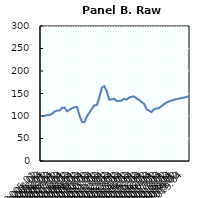
| Category | Raw materials |
|---|---|
| 2005:01 | 100 |
| 2005:02 | 100.169 |
| 2005:03 | 101.896 |
| 2005:04 | 102.191 |
| 2006:01 | 105.183 |
| 2006:02 | 110.029 |
| 2006:03 | 111.968 |
| 2006:04 | 112.347 |
| 2007:01 | 118.373 |
| 2007:02 | 118.668 |
| 2007:03 | 110.535 |
| 2007:04 | 113.906 |
| 2008:01 | 117.488 |
| 2008:02 | 119.385 |
| 2008:03 | 119.89 |
| 2008:04 | 101.475 |
| 2009:01 | 87.021 |
| 2009:02 | 86.304 |
| 2009:03 | 99.157 |
| 2009:04 | 107.206 |
| 2010:01 | 116.182 |
| 2010:02 | 123.683 |
| 2010:03 | 124.231 |
| 2010:04 | 141.593 |
| 2011:01 | 163.211 |
| 2011:02 | 166.33 |
| 2011:03 | 154.488 |
| 2011:04 | 136.241 |
| 2012:01 | 137 |
| 2012:02 | 138.053 |
| 2012:03 | 133.249 |
| 2012:04 | 133.418 |
| 2013:01 | 134.555 |
| 2013:02 | 138.432 |
| 2013:03 | 136.452 |
| 2013:04 | 140.834 |
| 2014:01 | 142.773 |
| 2014:02 | 143.447 |
| 2014:03 | 139.191 |
| 2014:04 | 135.651 |
| 2015:01 | 130.973 |
| 2015:02 | 127.307 |
| 2015:03 | 115.129 |
| 2015:04 | 112.094 |
| 2016:01 | 108.681 |
| 2016:02 | 114.876 |
| 2016:03 | 116.772 |
| 2016:04 | 117.488 |
| 2017:01 | 121.702 |
| 2017:02 | 126.072 |
| 2017:03 | 129.66 |
| 2017:04 | 132.402 |
| 2018:01 | 134.365 |
| 2018:02 | 135.901 |
| 2018:03 | 137.293 |
| 2018:04 | 138.54 |
| 2019:01 | 139.75 |
| 2019:02 | 140.946 |
| 2019:03 | 142.175 |
| 2019:04 | 143.434 |